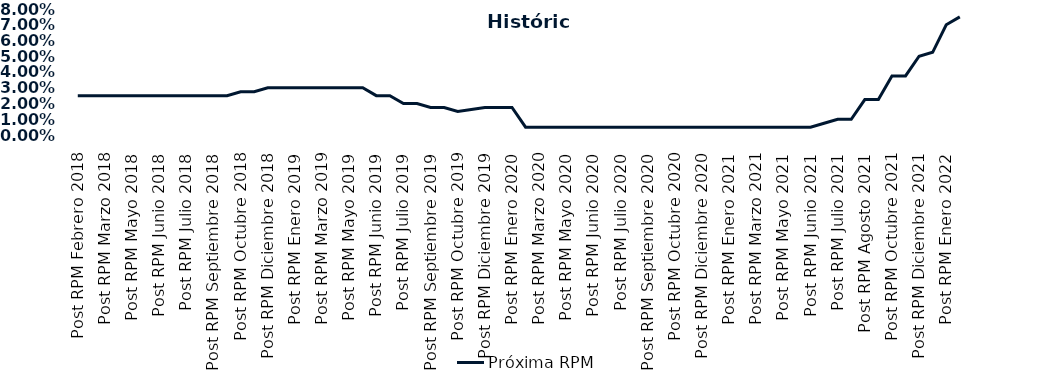
| Category | Próxima RPM |
|---|---|
| Post RPM Febrero 2018 | 0.025 |
| Pre RPM Marzo 2018 | 0.025 |
| Post RPM Marzo 2018 | 0.025 |
| Pre RPM Mayo 2018 | 0.025 |
| Post RPM Mayo 2018 | 0.025 |
| Pre RPM Junio 2018 | 0.025 |
| Post RPM Junio 2018 | 0.025 |
| Pre RPM Julio 2018 | 0.025 |
| Post RPM Julio 2018 | 0.025 |
| Pre RPM Septiembre 2018 | 0.025 |
| Post RPM Septiembre 2018 | 0.025 |
| Pre RPM Octubre 2018 | 0.025 |
| Post RPM Octubre 2018 | 0.028 |
| Pre RPM Diciembre 2018 | 0.028 |
| Post RPM Diciembre 2018 | 0.03 |
| Pre RPM Enero 2019 | 0.03 |
| Post RPM Enero 2019 | 0.03 |
| Pre RPM Marzo 2019 | 0.03 |
| Post RPM Marzo 2019 | 0.03 |
| Pre RPM Mayo 2019 | 0.03 |
| Post RPM Mayo 2019 | 0.03 |
| Pre RPM Junio 2019 | 0.03 |
| Post RPM Junio 2019 | 0.025 |
| Pre RPM Julio 2019 | 0.025 |
| Post RPM Julio 2019 | 0.02 |
| Pre RPM Septiembre 2019 | 0.02 |
| Post RPM Septiembre 2019 | 0.018 |
| Pre RPM Octubre 2019 | 0.018 |
| Post RPM Octubre 2019 | 0.015 |
| Pre RPM Diciembre 2019 | 0.016 |
| Post RPM Diciembre 2019 | 0.018 |
| Pre RPM Enero 2020 | 0.018 |
| Post RPM Enero 2020 | 0.018 |
| Pre RPM Marzo 2020 | 0.005 |
| Post RPM Marzo 2020 | 0.005 |
| Pre RPM Mayo 2020 | 0.005 |
| Post RPM Mayo 2020 | 0.005 |
| Pre RPM Junio 2020 | 0.005 |
| Post RPM Junio 2020 | 0.005 |
| Pre RPM Julio 2020 | 0.005 |
| Post RPM Julio 2020 | 0.005 |
| Pre RPM Septiembre 2020 | 0.005 |
| Post RPM Septiembre 2020 | 0.005 |
| Pre RPM Octubre 2020 | 0.005 |
| Post RPM Octubre 2020 | 0.005 |
| Pre RPM Diciembre 2020 | 0.005 |
| Post RPM Diciembre 2020 | 0.005 |
| Pre RPM Enero 2021 | 0.005 |
| Post RPM Enero 2021 | 0.005 |
| Pre RPM Marzo 2021 | 0.005 |
| Post RPM Marzo 2021 | 0.005 |
| Pre RPM Mayo 2021 | 0.005 |
| Post RPM Mayo 2021 | 0.005 |
| Pre RPM Junio 2021 | 0.005 |
| Post RPM Junio 2021 | 0.005 |
| Pre RPM Julio 2021 | 0.008 |
| Post RPM Julio 2021 | 0.01 |
| Pre RPM Agosto 2021 | 0.01 |
| Post RPM Agosto 2021 | 0.022 |
| Pre RPM Octubre 2021 | 0.022 |
| Post RPM Octubre 2021 | 0.038 |
| Pre RPM Diciembre 2021 | 0.038 |
| Post RPM Diciembre 2021 | 0.05 |
| Pre RPM Enero 2022 | 0.052 |
| Post RPM Enero 2022 | 0.07 |
| Pre RPM Marzo 2022 | 0.075 |